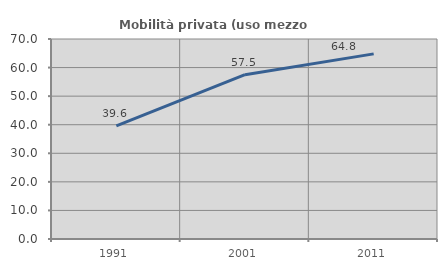
| Category | Mobilità privata (uso mezzo privato) |
|---|---|
| 1991.0 | 39.569 |
| 2001.0 | 57.496 |
| 2011.0 | 64.789 |